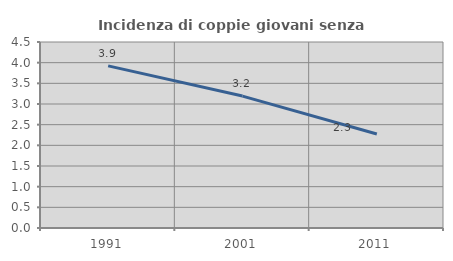
| Category | Incidenza di coppie giovani senza figli |
|---|---|
| 1991.0 | 3.922 |
| 2001.0 | 3.191 |
| 2011.0 | 2.273 |